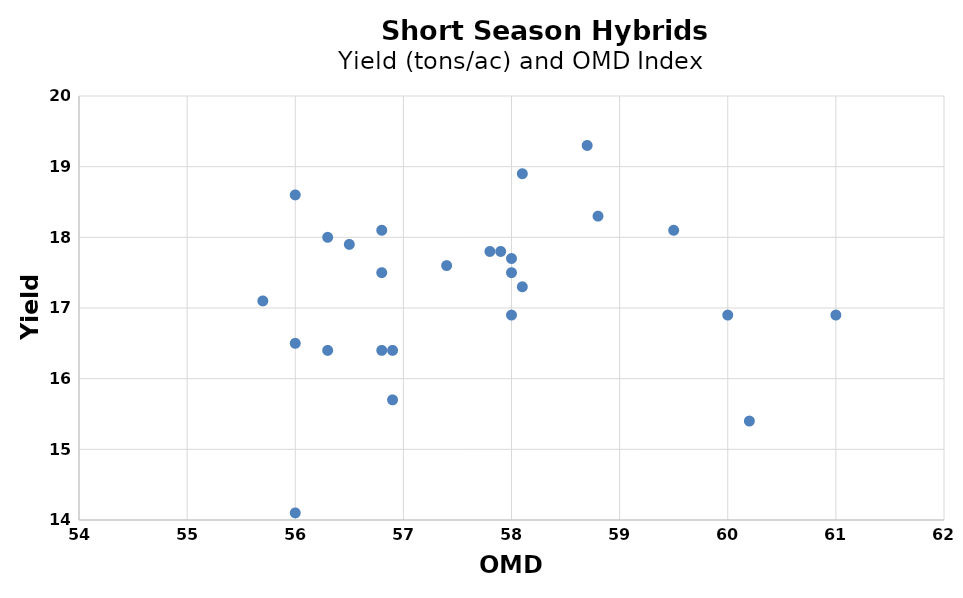
| Category | Series 0 |
|---|---|
| 56.0 | 14.1 |
| 56.5 | 17.9 |
| 58.7 | 19.3 |
| 58.0 | 17.5 |
| 56.0 | 16.5 |
| 57.4 | 17.6 |
| 58.1 | 17.3 |
| 56.0 | 18.6 |
| 60.0 | 16.9 |
| 56.8 | 16.4 |
| 58.0 | 16.9 |
| 56.3 | 18 |
| 56.8 | 18.1 |
| 58.0 | 17.7 |
| 59.5 | 18.1 |
| 56.8 | 17.5 |
| 57.9 | 17.8 |
| 56.9 | 16.4 |
| 55.7 | 17.1 |
| 57.8 | 17.8 |
| 56.9 | 15.7 |
| 56.3 | 16.4 |
| 58.1 | 18.9 |
| 60.2 | 15.4 |
| 58.8 | 18.3 |
| 61.0 | 16.9 |